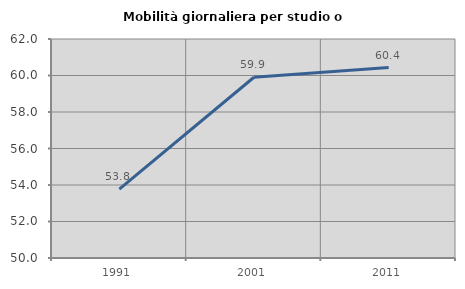
| Category | Mobilità giornaliera per studio o lavoro |
|---|---|
| 1991.0 | 53.77 |
| 2001.0 | 59.905 |
| 2011.0 | 60.435 |